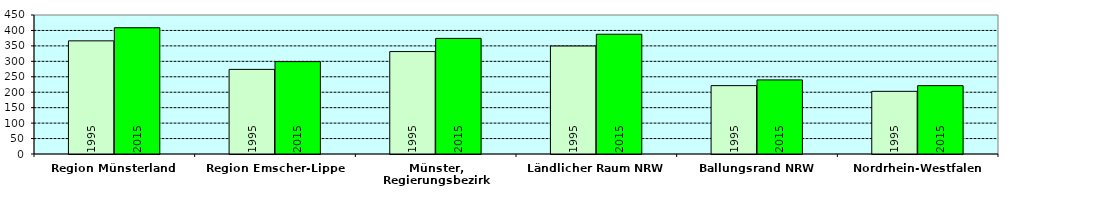
| Category | 1995 | 2015 |
|---|---|---|
| Region Münsterland | 366.332 | 408.736 |
| Region Emscher-Lippe | 273.944 | 299.063 |
| Münster, Regierungsbezirk | 331.605 | 374.225 |
| Ländlicher Raum NRW | 349.563 | 387.682 |
| Ballungsrand NRW | 221.343 | 239.828 |
| Nordrhein-Westfalen | 202.886 | 221.295 |